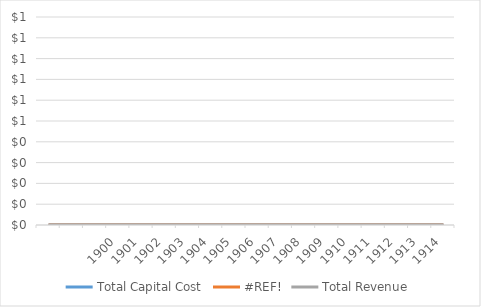
| Category | Total Capital Cost | #REF! | Total Revenue |
|---|---|---|---|
|  | 0 | 0 | 0 |
|  | 0 | 0 | 0 |
|  | 0 | 0 | 0 |
| 1900 | 0 | 0 | 0 |
| 1901 | 0 | 0 | 0 |
| 1902 | 0 | 0 | 0 |
| 1903 | 0 | 0 | 0 |
| 1904 | 0 | 0 | 0 |
| 1905 | 0 | 0 | 0 |
| 1906 | 0 | 0 | 0 |
| 1907 | 0 | 0 | 0 |
| 1908 | 0 | 0 | 0 |
| 1909 | 0 | 0 | 0 |
| 1910 | 0 | 0 | 0 |
| 1911 | 0 | 0 | 0 |
| 1912 | 0 | 0 | 0 |
| 1913 | 0 | 0 | 0 |
| 1914 | 0 | 0 | 0 |